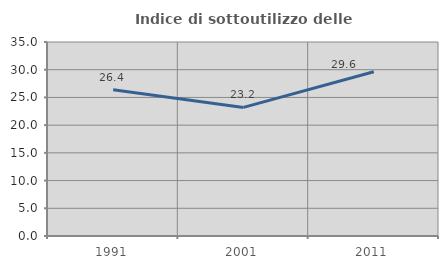
| Category | Indice di sottoutilizzo delle abitazioni  |
|---|---|
| 1991.0 | 26.385 |
| 2001.0 | 23.202 |
| 2011.0 | 29.622 |